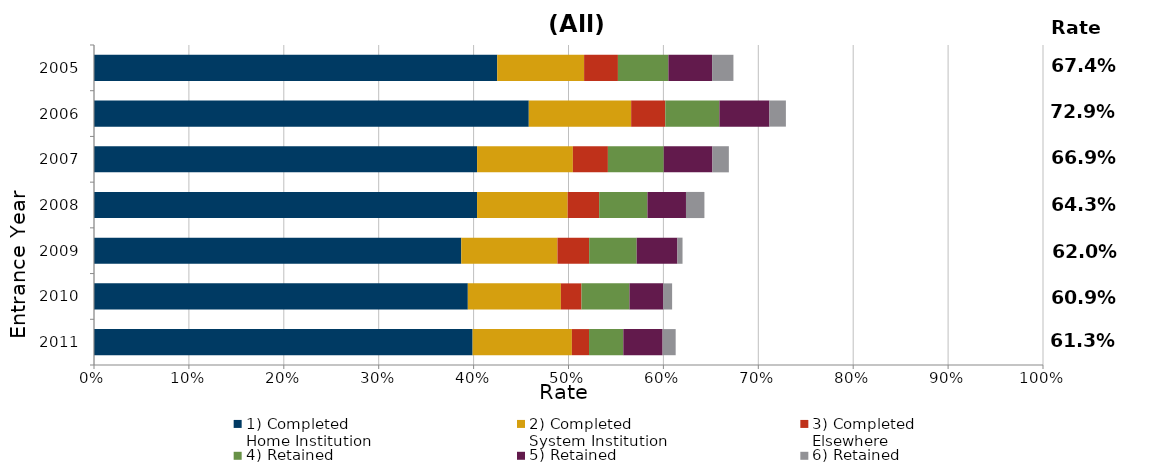
| Category | 1) Completed 
Home Institution | 2) Completed 
System Institution | 3) Completed 
Elsewhere | 4) Retained 
Home Institution | 5) Retained 
System Institution | 6) Retained 
Elsewhere | 7) Stopped Out |
|---|---|---|---|---|---|---|---|
| 2011.0 | 0.399 | 0.105 | 0.018 | 0.036 | 0.041 | 0.014 | 0.387 |
| 2010.0 | 0.394 | 0.098 | 0.022 | 0.051 | 0.036 | 0.009 | 0.391 |
| 2009.0 | 0.387 | 0.101 | 0.033 | 0.05 | 0.043 | 0.005 | 0.38 |
| 2008.0 | 0.404 | 0.095 | 0.033 | 0.051 | 0.041 | 0.019 | 0.357 |
| 2007.0 | 0.404 | 0.101 | 0.037 | 0.059 | 0.051 | 0.017 | 0.331 |
| 2006.0 | 0.458 | 0.108 | 0.036 | 0.057 | 0.053 | 0.017 | 0.271 |
| 2005.0 | 0.425 | 0.092 | 0.036 | 0.053 | 0.046 | 0.022 | 0.326 |